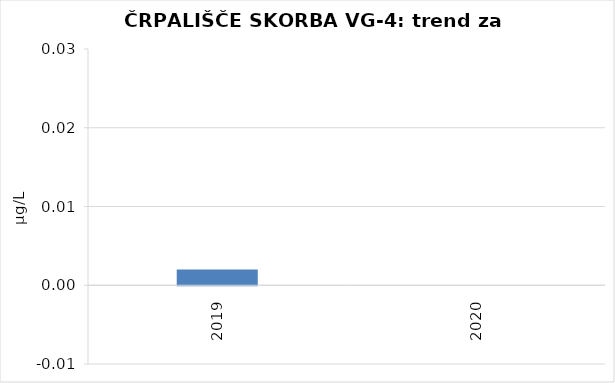
| Category | Vsota |
|---|---|
| 2019 | 0.002 |
| 2020 | 0 |